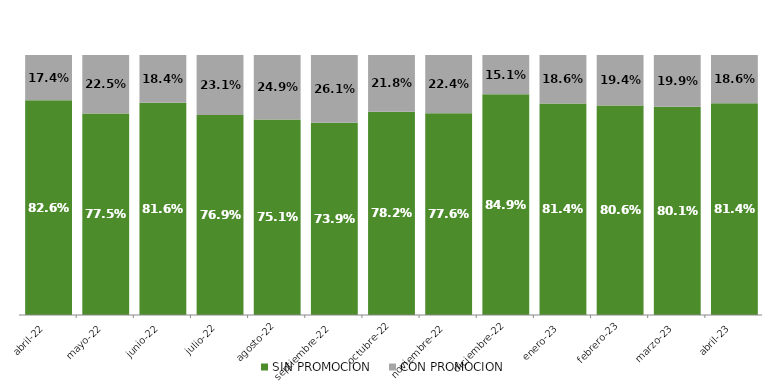
| Category | SIN PROMOCION   | CON PROMOCION   |
|---|---|---|
| 2022-04-01 | 0.826 | 0.174 |
| 2022-05-01 | 0.775 | 0.225 |
| 2022-06-01 | 0.816 | 0.184 |
| 2022-07-01 | 0.769 | 0.231 |
| 2022-08-01 | 0.751 | 0.249 |
| 2022-09-01 | 0.739 | 0.261 |
| 2022-10-01 | 0.782 | 0.218 |
| 2022-11-01 | 0.776 | 0.224 |
| 2022-12-01 | 0.849 | 0.151 |
| 2023-01-01 | 0.814 | 0.186 |
| 2023-02-01 | 0.806 | 0.194 |
| 2023-03-01 | 0.801 | 0.199 |
| 2023-04-01 | 0.814 | 0.186 |